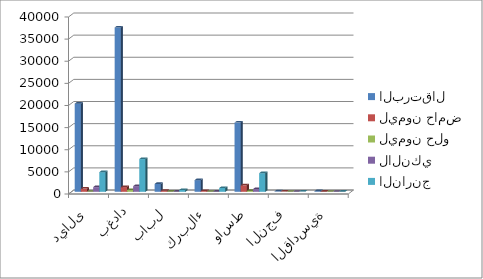
| Category | البرتقال | ليمون حامض | ليمون حلو | لالنكي | النارنج |
|---|---|---|---|---|---|
| ديالى | 19919 | 720 | 0 | 1061 | 4440 |
| بغداد | 37129 | 1048 | 390 | 1266 | 7400 |
| بابل | 1774 | 238 | 26 | 18 | 410 |
| كربلاء | 2632 | 170 | 12 | 37 | 861 |
| واسط | 15631 | 1459 | 201 | 608 | 4202 |
| النجف | 105 | 43 | 0 | 0 | 51 |
| القادسية | 140 | 32 | 0 | 0 | 29 |